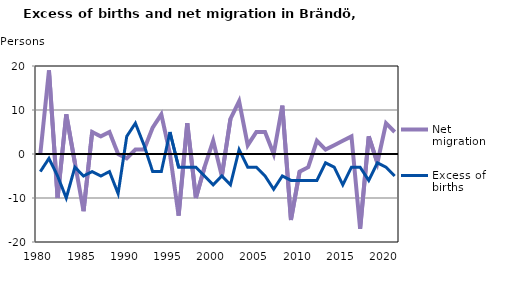
| Category | Net migration | Excess of births |
|---|---|---|
| 1980.0 | 0 | -4 |
| 1981.0 | 19 | -1 |
| 1982.0 | -10 | -5 |
| 1983.0 | 9 | -10 |
| 1984.0 | -2 | -3 |
| 1985.0 | -13 | -5 |
| 1986.0 | 5 | -4 |
| 1987.0 | 4 | -5 |
| 1988.0 | 5 | -4 |
| 1989.0 | 0 | -9 |
| 1990.0 | -1 | 4 |
| 1991.0 | 1 | 7 |
| 1992.0 | 1 | 2 |
| 1993.0 | 6 | -4 |
| 1994.0 | 9 | -4 |
| 1995.0 | 0 | 5 |
| 1996.0 | -14 | -3 |
| 1997.0 | 7 | -3 |
| 1998.0 | -10 | -3 |
| 1999.0 | -3 | -5 |
| 2000.0 | 3 | -7 |
| 2001.0 | -5 | -5 |
| 2002.0 | 8 | -7 |
| 2003.0 | 12 | 1 |
| 2004.0 | 2 | -3 |
| 2005.0 | 5 | -3 |
| 2006.0 | 5 | -5 |
| 2007.0 | 0 | -8 |
| 2008.0 | 11 | -5 |
| 2009.0 | -15 | -6 |
| 2010.0 | -4 | -6 |
| 2011.0 | -3 | -6 |
| 2012.0 | 3 | -6 |
| 2013.0 | 1 | -2 |
| 2014.0 | 2 | -3 |
| 2015.0 | 3 | -7 |
| 2016.0 | 4 | -3 |
| 2017.0 | -17 | -3 |
| 2018.0 | 4 | -6 |
| 2019.0 | -2 | -2 |
| 2020.0 | 7 | -3 |
| 2021.0 | 5 | -5 |